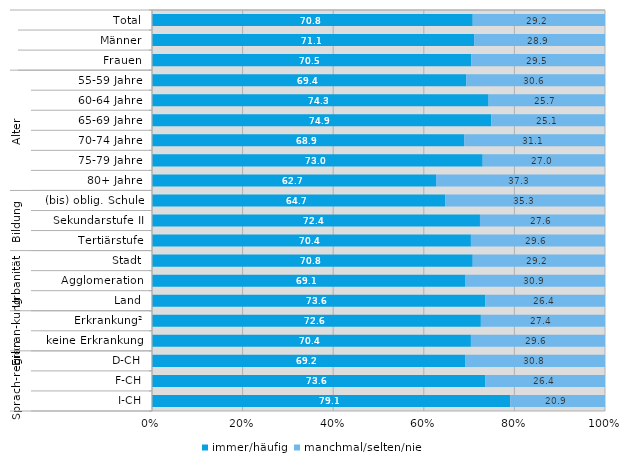
| Category | immer/häufig | manchmal/selten/nie |
|---|---|---|
| 0 | 70.8 | 29.2 |
| 1 | 71.1 | 28.9 |
| 2 | 70.5 | 29.5 |
| 3 | 69.4 | 30.6 |
| 4 | 74.3 | 25.7 |
| 5 | 74.9 | 25.1 |
| 6 | 68.9 | 31.1 |
| 7 | 73 | 27 |
| 8 | 62.7 | 37.3 |
| 9 | 64.7 | 35.3 |
| 10 | 72.4 | 27.6 |
| 11 | 70.4 | 29.6 |
| 12 | 70.8 | 29.2 |
| 13 | 69.1 | 30.9 |
| 14 | 73.6 | 26.4 |
| 15 | 72.6 | 27.4 |
| 16 | 70.4 | 29.6 |
| 17 | 69.2 | 30.8 |
| 18 | 73.6 | 26.4 |
| 19 | 79.1 | 20.9 |